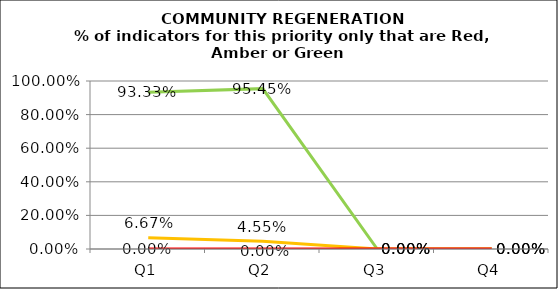
| Category | Green | Amber | Red |
|---|---|---|---|
| Q1 | 0.933 | 0.067 | 0 |
| Q2 | 0.955 | 0.045 | 0 |
| Q3 | 0 | 0 | 0 |
| Q4 | 0 | 0 | 0 |